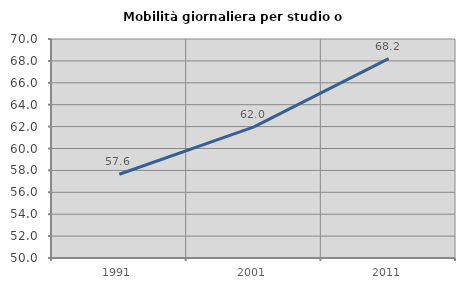
| Category | Mobilità giornaliera per studio o lavoro |
|---|---|
| 1991.0 | 57.647 |
| 2001.0 | 61.98 |
| 2011.0 | 68.209 |